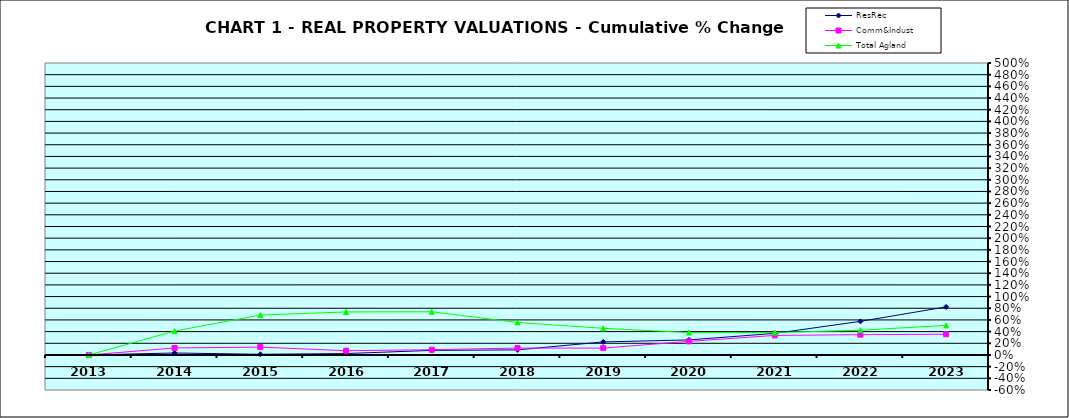
| Category | ResRec | Comm&Indust | Total Agland |
|---|---|---|---|
| 2013.0 | 0 | 0 | 0 |
| 2014.0 | 0.034 | 0.12 | 0.409 |
| 2015.0 | 0.012 | 0.135 | 0.683 |
| 2016.0 | 0.024 | 0.073 | 0.737 |
| 2017.0 | 0.079 | 0.09 | 0.74 |
| 2018.0 | 0.087 | 0.118 | 0.557 |
| 2019.0 | 0.223 | 0.118 | 0.456 |
| 2020.0 | 0.258 | 0.233 | 0.384 |
| 2021.0 | 0.369 | 0.334 | 0.384 |
| 2022.0 | 0.575 | 0.347 | 0.423 |
| 2023.0 | 0.823 | 0.355 | 0.506 |